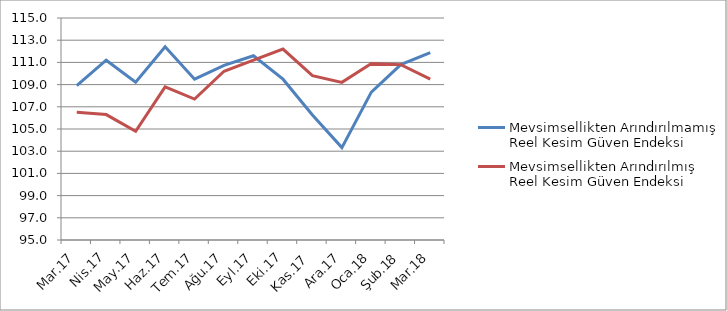
| Category | Mevsimsellikten Arındırılmamış Reel Kesim Güven Endeksi | Mevsimsellikten Arındırılmış Reel Kesim Güven Endeksi |
|---|---|---|
| Mar.17 | 108.9 | 106.5 |
| Nis.17 | 111.2 | 106.3 |
| May.17 | 109.225 | 104.8 |
| Haz.17 | 112.412 | 108.8 |
| Tem.17 | 109.488 | 107.7 |
| Ağu.17 | 110.738 | 110.2 |
| Eyl.17 | 111.6 | 111.2 |
| Eki.17 | 109.488 | 112.2 |
| Kas.17 | 106.262 | 109.8 |
| Ara.17 | 103.325 | 109.2 |
| Oca.18 | 108.325 | 110.9 |
| Şub.18 | 110.8 | 110.8 |
| Mar.18 | 111.888 | 109.5 |